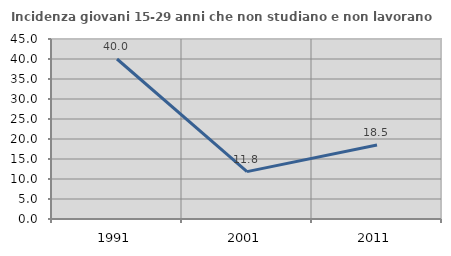
| Category | Incidenza giovani 15-29 anni che non studiano e non lavorano  |
|---|---|
| 1991.0 | 40 |
| 2001.0 | 11.843 |
| 2011.0 | 18.478 |